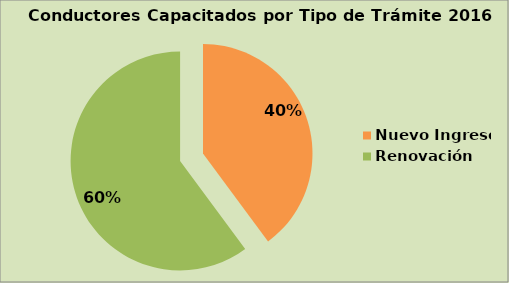
| Category | Series 0 |
|---|---|
| Nuevo Ingreso | 39.867 |
| Renovación | 60.133 |